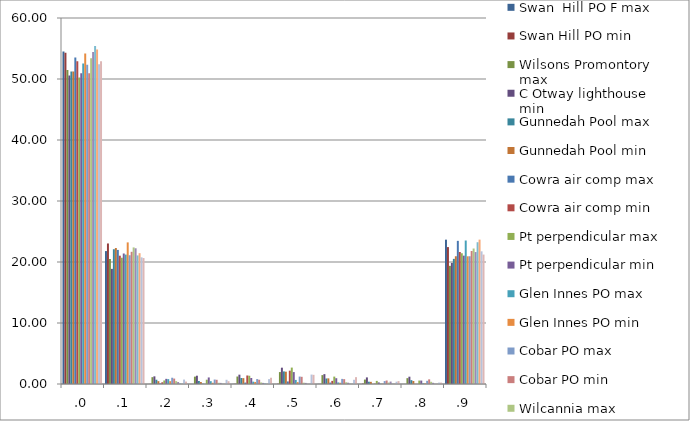
| Category | Swan  Hill PO F max | Swan Hill PO min | Wilsons Promontory max | C Otway lighthouse min | Gunnedah Pool max | Gunnedah Pool min | Cowra air comp max | Cowra air comp min | Pt perpendicular max | Pt perpendicular min | Glen Innes PO max | Glen Innes PO min | Cobar PO max | Cobar PO min | Wilcannia max | Wilcannia min | Moree PO max | Moree PO min | Maryborough Q max | Maryborough Q min |
|---|---|---|---|---|---|---|---|---|---|---|---|---|---|---|---|---|---|---|---|---|
| .0 | 54.506 | 54.321 | 51.484 | 50.556 | 51.247 | 51.234 | 53.532 | 52.908 | 50.255 | 50.932 | 52.542 | 54.186 | 52.327 | 50.942 | 53.384 | 54.43 | 55.407 | 54.828 | 52.41 | 52.921 |
| .1 | 21.789 | 23.038 | 20.49 | 18.874 | 22.092 | 22.289 | 21.98 | 21.033 | 20.696 | 21.393 | 21.212 | 23.215 | 21.106 | 21.671 | 22.39 | 22.248 | 21.078 | 21.444 | 20.767 | 20.647 |
| .2 | 0 | 0.022 | 1.12 | 1.256 | 0.698 | 0.465 | 0.093 | 0.279 | 0.58 | 0.844 | 0.796 | 0.462 | 1.027 | 0.888 | 0.468 | 0.327 | 0.091 | 0 | 0.727 | 0.4 |
| .3 | 0 | 0 | 1.208 | 1.36 | 0.492 | 0.323 | 0.046 | 0 | 0.703 | 1.073 | 0.462 | 0.205 | 0.731 | 0.69 | 0.198 | 0.182 | 0.03 | 0.03 | 0.691 | 0.457 |
| .4 | 0.022 | 0.044 | 1.226 | 1.531 | 0.984 | 0.958 | 0.232 | 1.396 | 1.354 | 0.985 | 0.385 | 0.334 | 0.809 | 0.697 | 0.252 | 0.182 | 0.091 | 0 | 0.8 | 1.028 |
| .5 | 0 | 0.044 | 1.955 | 2.676 | 2.064 | 2.02 | 0.418 | 2.187 | 2.69 | 1.953 | 0.668 | 0.308 | 1.218 | 1.18 | 0.216 | 0.182 | 0 | 0 | 1.546 | 1.503 |
| .6 | 0.022 | 0.022 | 1.457 | 1.62 | 0.905 | 0.923 | 0.232 | 0.512 | 1.213 | 0.95 | 0.257 | 0.205 | 0.837 | 0.794 | 0.288 | 0.218 | 0.03 | 0 | 0.691 | 1.123 |
| .7 | 0 | 0.066 | 0.729 | 1.082 | 0.375 | 0.354 | 0 | 0.047 | 0.51 | 0.264 | 0.051 | 0.051 | 0.48 | 0.573 | 0.234 | 0.4 | 0.03 | 0.03 | 0.382 | 0.476 |
| .8 | 0 | 0 | 0.96 | 1.199 | 0.63 | 0.493 | 0 | 0 | 0.563 | 0.563 | 0.103 | 0.103 | 0.523 | 0.761 | 0.36 | 0.2 | 0 | 0 | 0.236 | 0.228 |
| .9 | 23.661 | 22.443 | 19.371 | 19.847 | 20.513 | 20.942 | 23.467 | 21.638 | 21.435 | 21.042 | 23.523 | 20.93 | 20.943 | 21.803 | 22.21 | 21.63 | 23.241 | 23.667 | 21.749 | 21.218 |